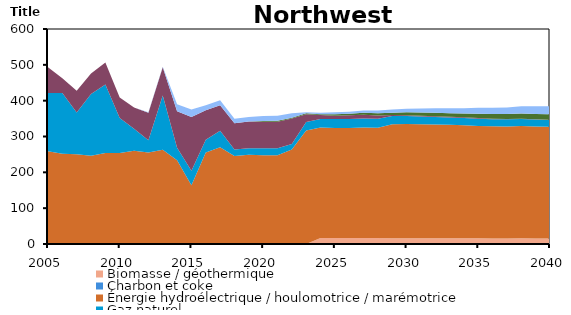
| Category | Biomasse / géothermique | Charbon et coke | Énergie hydroélectrique / houlomotrice / marémotrice | Gaz naturel | Pétrole | Solaire | Uranium | Éolien |
|---|---|---|---|---|---|---|---|---|
| 2005.0 | 0 | 0 | 259.107 | 162.401 | 71.627 | 0 | 0 | 0 |
| 2006.0 | 0 | 0 | 251.866 | 169.772 | 41.215 | 0 | 0 | 0 |
| 2007.0 | 0 | 0 | 250.246 | 116.923 | 60.645 | 0 | 0 | 0 |
| 2008.0 | 0 | 0 | 246.575 | 171.912 | 57.56 | 0 | 0 | 0 |
| 2009.0 | 0 | 0 | 253.952 | 191.497 | 61.1 | 0 | 0 | 0 |
| 2010.0 | 0 | 0 | 253.952 | 97.44 | 57.78 | 0 | 0 | 0 |
| 2011.0 | 0 | 0 | 260.345 | 61.318 | 59.13 | 0 | 0 | 0 |
| 2012.0 | 0 | 0 | 255.196 | 34.27 | 77.16 | 0 | 0 | 1.3 |
| 2013.0 | 0 | 0 | 262.758 | 151.62 | 78.73 | 0 | 0 | 1.6 |
| 2014.0 | 0 | 0 | 233.817 | 35 | 101.67 | 0 | 0 | 19.854 |
| 2015.0 | 0 | 0 | 163.837 | 40.6 | 149.87 | 0 | 0 | 20.782 |
| 2016.0 | 0 | 0 | 255.272 | 36 | 81.83 | 0 | 0 | 14.298 |
| 2017.0 | 0 | 0 | 270.289 | 45.927 | 71.21 | 0 | 0 | 14.066 |
| 2018.0 | 0 | 0 | 245.522 | 18.212 | 72.962 | 0.616 | 0 | 12.361 |
| 2019.0 | 0 | 0 | 249.114 | 18.317 | 74.109 | 0.625 | 0 | 12.541 |
| 2020.0 | 0 | 0 | 247.717 | 19.494 | 74.081 | 2.171 | 0 | 14.004 |
| 2021.0 | 0 | 0 | 247.731 | 19.483 | 74.252 | 2.172 | 0 | 14.004 |
| 2022.0 | 0 | 0 | 263.439 | 15.72 | 71.21 | 1.982 | 0 | 12.778 |
| 2023.0 | 0 | 0 | 317.036 | 23.669 | 21.642 | 2.444 | 0 | 2.936 |
| 2024.0 | 16.923 | 0 | 308.502 | 23.339 | 11.292 | 2.369 | 0 | 4.073 |
| 2025.0 | 16.823 | 0 | 306.942 | 25.091 | 9.343 | 4.037 | 0 | 5.316 |
| 2026.0 | 16.814 | 0 | 306.804 | 25.091 | 10.28 | 4.604 | 0 | 5.313 |
| 2027.0 | 16.936 | 0 | 308.299 | 25.091 | 10.41 | 5.194 | 0 | 6.707 |
| 2028.0 | 16.874 | 0 | 307.326 | 25.091 | 9.662 | 5.74 | 0 | 8.032 |
| 2029.0 | 16.041 | 0 | 318.451 | 22.84 | 2.797 | 5.998 | 0 | 8.919 |
| 2030.0 | 16.06 | 0 | 319.112 | 21.936 | 2.239 | 8.151 | 0 | 10.214 |
| 2031.0 | 16.007 | 0 | 318.218 | 21.452 | 2.386 | 8.667 | 0 | 11.461 |
| 2032.0 | 15.954 | 0 | 317.326 | 20.938 | 2.611 | 9.234 | 0 | 12.7 |
| 2033.0 | 15.907 | 0 | 316.537 | 20.38 | 2.287 | 9.804 | 0 | 13.934 |
| 2034.0 | 15.854 | 0 | 315.647 | 19.876 | 2.161 | 10.374 | 0 | 15.156 |
| 2035.0 | 15.741 | 0 | 313.681 | 20.368 | 1.539 | 12.48 | 0 | 16.308 |
| 2036.0 | 15.68 | 0 | 312.605 | 20.096 | 1.244 | 13.039 | 0 | 17.498 |
| 2037.0 | 15.656 | 0 | 312.294 | 19.894 | 1.012 | 13.633 | 0 | 18.725 |
| 2038.0 | 15.752 | 0 | 313.562 | 19.384 | 1.154 | 14.337 | 0 | 20.099 |
| 2039.0 | 15.689 | 0 | 312.48 | 19.02 | 0.917 | 14.906 | 0 | 21.274 |
| 2040.0 | 15.619 | 0 | 311.194 | 18.92 | 0.745 | 15.467 | 0 | 22.429 |